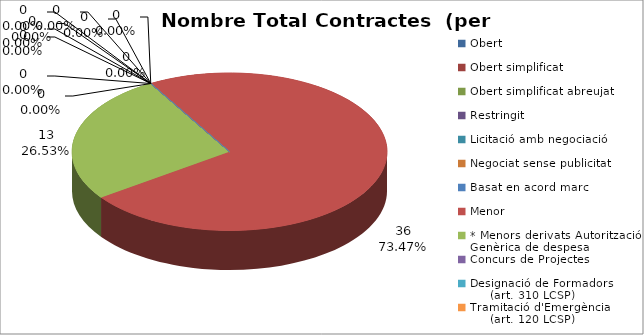
| Category | Nombre Total Contractes |
|---|---|
| Obert | 0 |
| Obert simplificat | 0 |
| Obert simplificat abreujat | 0 |
| Restringit | 0 |
| Licitació amb negociació | 0 |
| Negociat sense publicitat | 0 |
| Basat en acord marc | 0 |
| Menor | 36 |
| * Menors derivats Autorització Genèrica de despesa | 13 |
| Concurs de Projectes | 0 |
| Designació de Formadors
     (art. 310 LCSP) | 0 |
| Tramitació d'Emergència
     (art. 120 LCSP) | 0 |